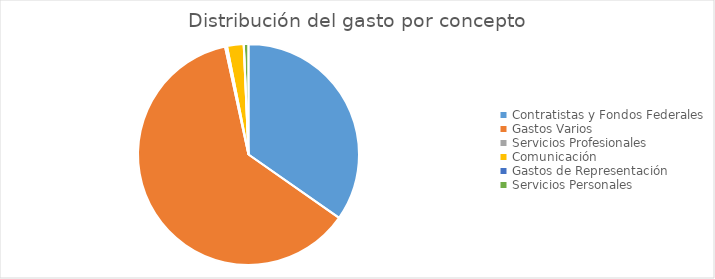
| Category | Series 0 |
|---|---|
| Contratistas y Fondos Federales | 212675336.71 |
| Gastos Varios | 379047606.84 |
| Servicios Profesionales | 1817237.65 |
| Comunicación | 14852830.94 |
| Gastos de Representación | 64877.56 |
| Servicios Personales | 4176017.76 |